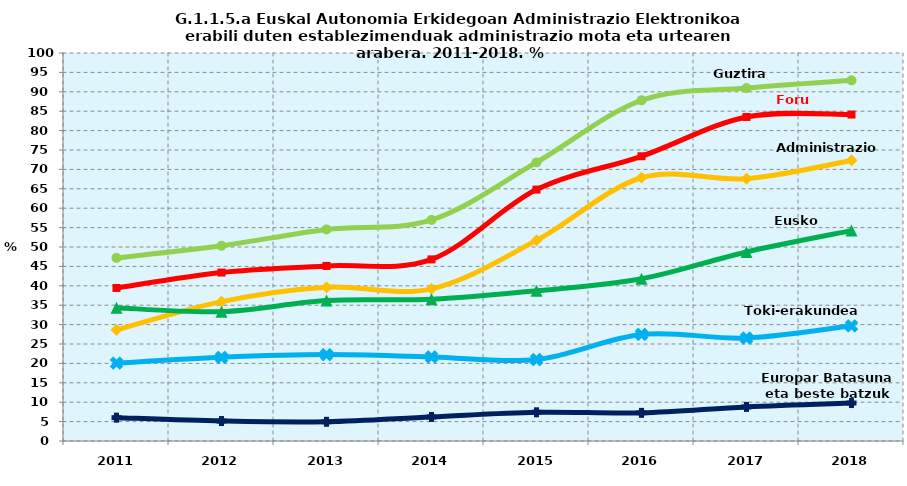
| Category | Guztira | Foru aldundiak | Administrazio Zentrala | Eusko Jaurlaritza | Toki-erakundeak | Europar Batasuna eta beste batzuk |
|---|---|---|---|---|---|---|
| 2011.0 | 47.195 | 39.446 | 28.619 | 34.347 | 20.063 | 6.017 |
| 2012.0 | 50.321 | 43.417 | 35.926 | 33.339 | 21.568 | 5.144 |
| 2013.0 | 54.524 | 45.118 | 39.622 | 36.207 | 22.264 | 4.948 |
| 2014.0 | 56.986 | 46.807 | 39.221 | 36.539 | 21.658 | 6.198 |
| 2015.0 | 71.8 | 64.8 | 51.7 | 38.7 | 21 | 7.4 |
| 2016.0 | 87.813 | 73.385 | 67.853 | 41.82 | 27.461 | 7.249 |
| 2017.0 | 90.959 | 83.514 | 67.612 | 48.718 | 26.543 | 8.784 |
| 2018.0 | 92.961 | 84.142 | 72.311 | 54.229 | 29.694 | 9.782 |